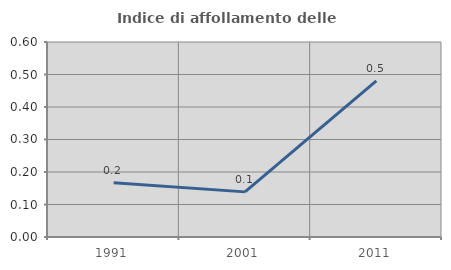
| Category | Indice di affollamento delle abitazioni  |
|---|---|
| 1991.0 | 0.167 |
| 2001.0 | 0.139 |
| 2011.0 | 0.48 |